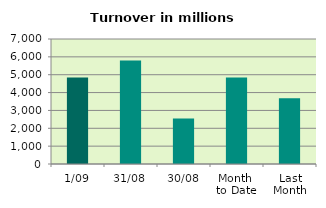
| Category | Series 0 |
|---|---|
| 1/09 | 4840.848 |
| 31/08 | 5791.437 |
| 30/08 | 2545.248 |
| Month 
to Date | 4840.848 |
| Last
Month | 3679.291 |